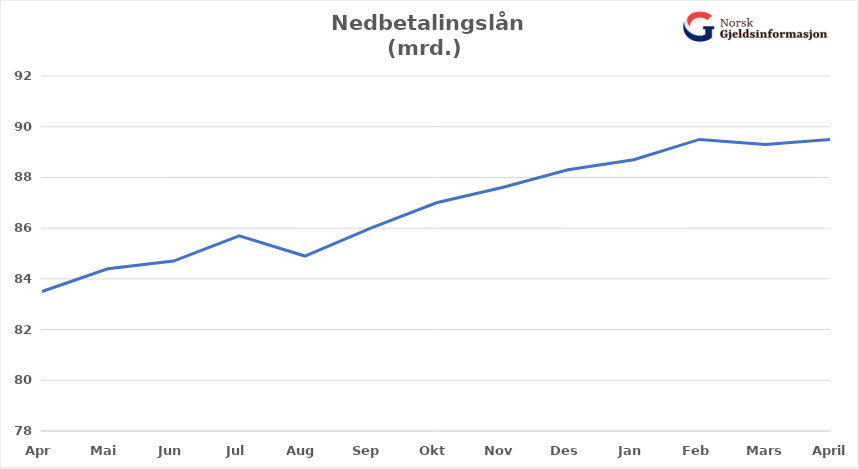
| Category | Nedbetalingslån |
|---|---|
| Apr | 83.5 |
| Mai | 84.4 |
| Jun | 84.7 |
| Jul | 85.7 |
| Aug | 84.9 |
| Sep | 86 |
| Okt | 87 |
| Nov | 87.6 |
| Des | 88.3 |
| Jan | 88.7 |
| Feb | 89.5 |
| Mars | 89.3 |
| April | 89.5 |